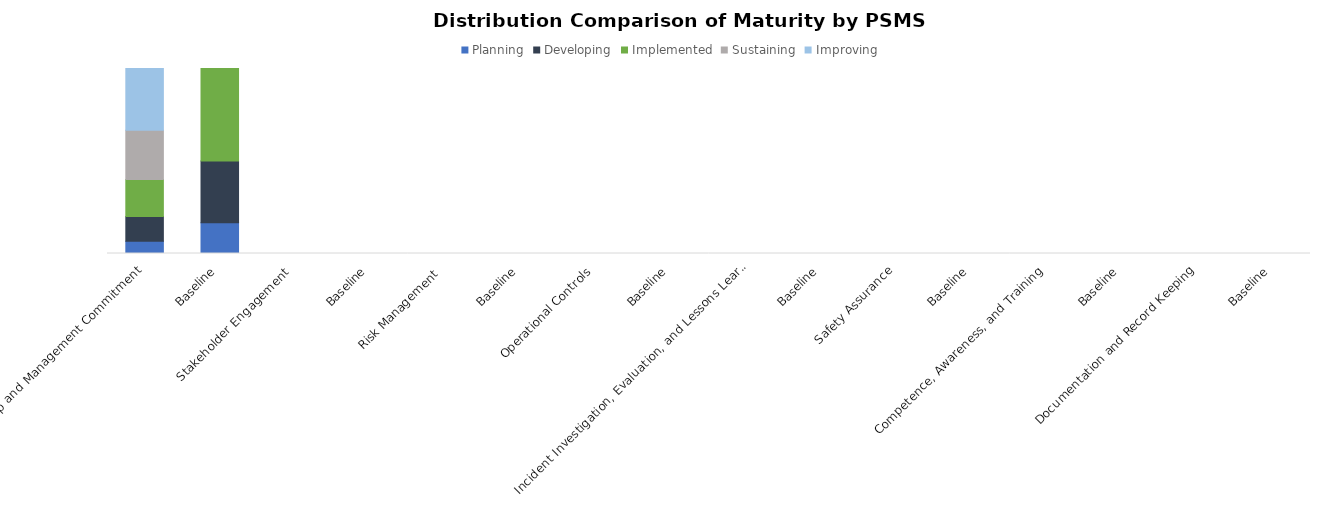
| Category | Planning | Developing | Implemented | Sustaining | Improving |
|---|---|---|---|---|---|
| Leadership and Management Commitment | 1 | 2 | 3 | 4 | 5 |
| Baseline | 1 | 2 | 3 | 0 | 0 |
| Stakeholder Engagement  | 0 | 0 | 0 | 0 | 0 |
| Baseline | 0 | 0 | 0 | 0 | 0 |
| Risk Management  | 0 | 0 | 0 | 0 | 0 |
| Baseline | 0 | 0 | 0 | 0 | 0 |
| Operational Controls | 0 | 0 | 0 | 0 | 0 |
| Baseline | 0 | 0 | 0 | 0 | 0 |
| Incident Investigation, Evaluation, and Lessons Learned | 0 | 0 | 0 | 0 | 0 |
| Baseline | 0 | 0 | 0 | 0 | 0 |
| Safety Assurance | 0 | 0 | 0 | 0 | 0 |
| Baseline | 0 | 0 | 0 | 0 | 0 |
| Competence, Awareness, and Training | 0 | 0 | 0 | 0 | 0 |
| Baseline | 0 | 0 | 0 | 0 | 0 |
| Documentation and Record Keeping | 0 | 0 | 0 | 0 | 0 |
| Baseline | 0 | 0 | 0 | 0 | 0 |